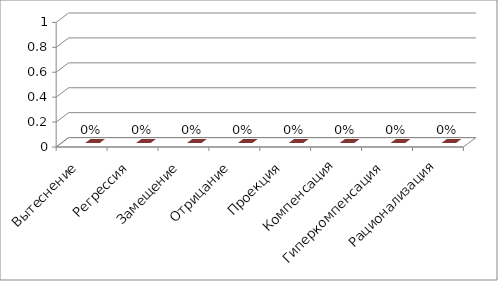
| Category | Series 0 | Series 1 |
|---|---|---|
| Вытеснение |  | 0 |
| Регрессия |  | 0 |
| Замещение |  | 0 |
| Отрицание |  | 0 |
| Проекция |  | 0 |
| Компенсация |  | 0 |
| Гиперкомпенсация |  | 0 |
| Рационализация |  | 0 |